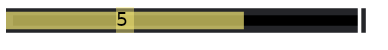
| Category | Ziel Zunahme | Ist Zunahme |
|---|---|---|
| 0 | 7.5 | 5 |